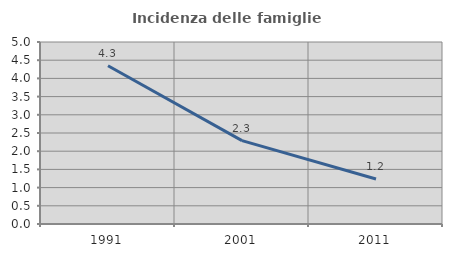
| Category | Incidenza delle famiglie numerose |
|---|---|
| 1991.0 | 4.348 |
| 2001.0 | 2.292 |
| 2011.0 | 1.237 |